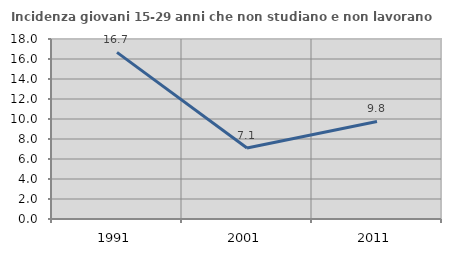
| Category | Incidenza giovani 15-29 anni che non studiano e non lavorano  |
|---|---|
| 1991.0 | 16.667 |
| 2001.0 | 7.092 |
| 2011.0 | 9.756 |